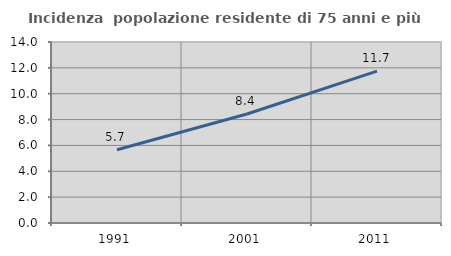
| Category | Incidenza  popolazione residente di 75 anni e più |
|---|---|
| 1991.0 | 5.666 |
| 2001.0 | 8.434 |
| 2011.0 | 11.742 |